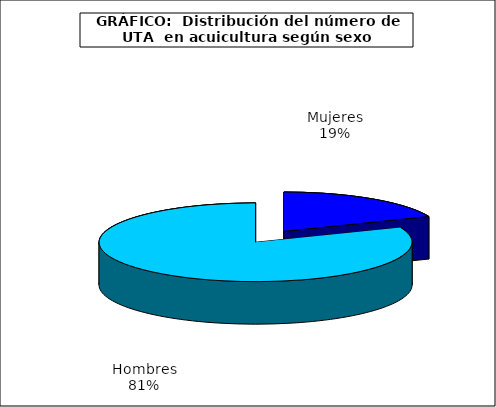
| Category | UTA | Series 1 |
|---|---|---|
| 0 | 1065.61 |  |
| 1 | 4590.028 |  |